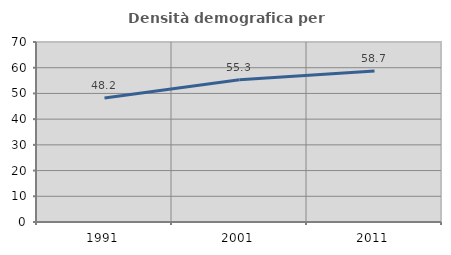
| Category | Densità demografica |
|---|---|
| 1991.0 | 48.209 |
| 2001.0 | 55.29 |
| 2011.0 | 58.695 |